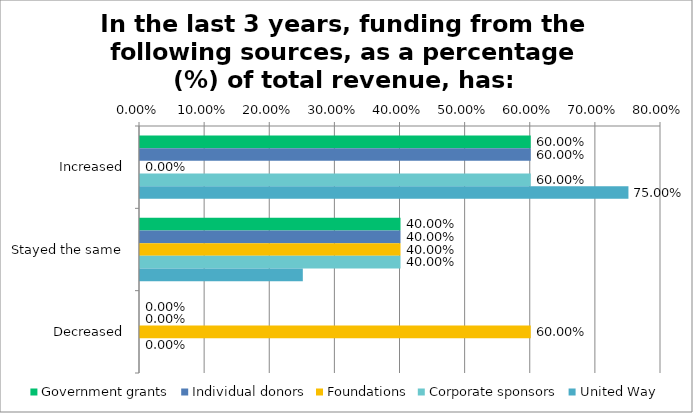
| Category | Government grants | Individual donors | Foundations | Corporate sponsors | United Way |
|---|---|---|---|---|---|
| Increased | 0.6 | 0.6 | 0 | 0.6 | 0.75 |
| Stayed the same | 0.4 | 0.4 | 0.4 | 0.4 | 0.25 |
| Decreased | 0 | 0 | 0.6 | 0 | 0 |